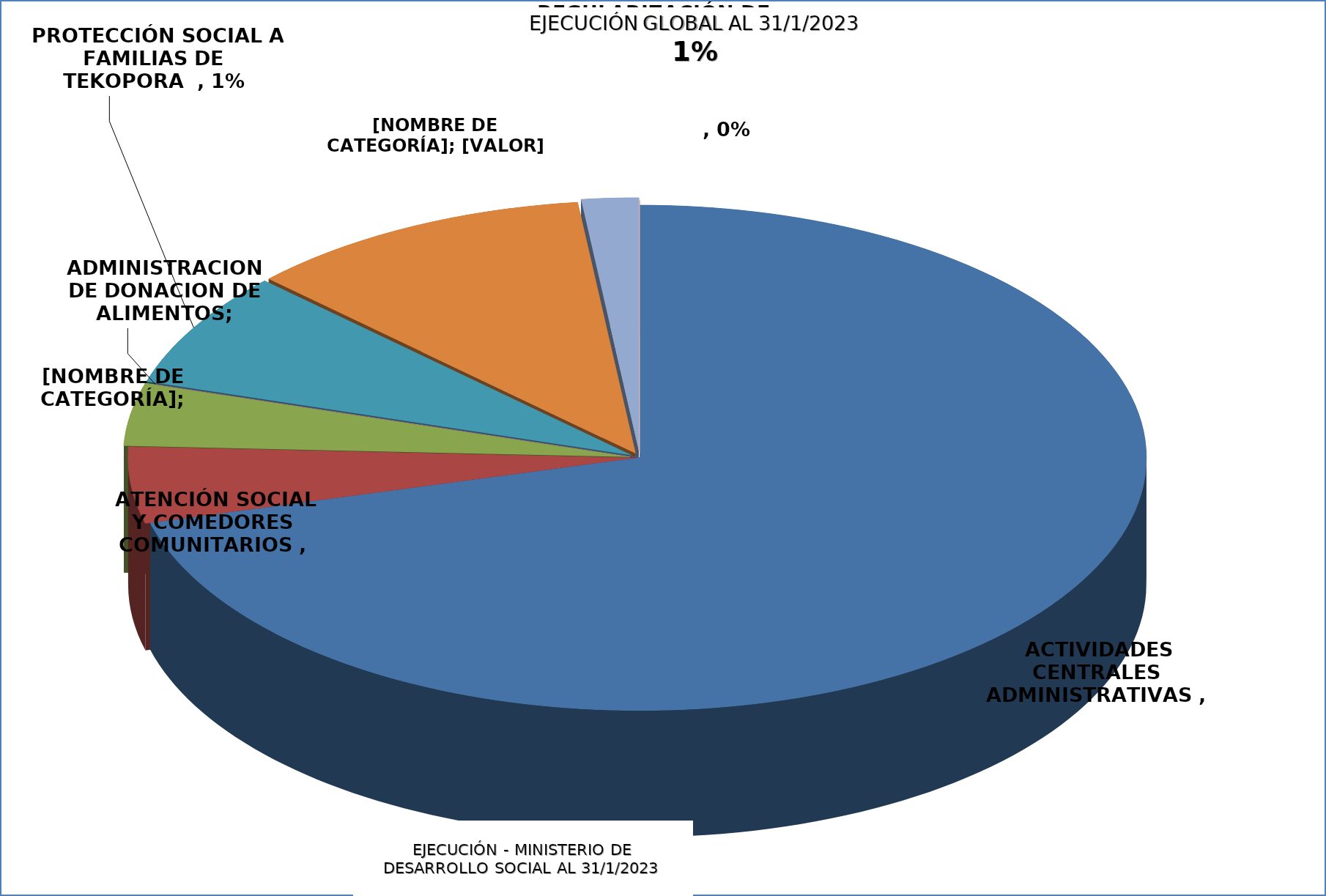
| Category | EJECUCIÓN - MINISTERIO DE DESARROLLO SOCIAL | ADMINISTRACION DE DANACION DE ALIMENTOS |
|---|---|---|
| ACTIVIDADES CENTRALES ADMINISTRATIVAS | 0.05 |  |
| ATENCIÓN SOCIAL Y COMEDORES COMUNITARIOS | 0.003 |  |
| ASISTENCIA A PESCADORES POR VEDA PESQUERA | 0.003 |  |
| ADMINISTRACION DE DONACION DE ALIMENTOS | 0 |  |
| PROTECCIÓN SOCIAL A FAMILIAS DE TEKOPORA  | 0.005 |  |
| FOMENTO DE MICROEMPRENDIMIENTOS A PARTICIPANTES DE TENONDERA | 0.008 |  |
| REGULARIZACIÓN DE TERRITORIOS SOCIALES, TEKOHA | 0.001 |  |